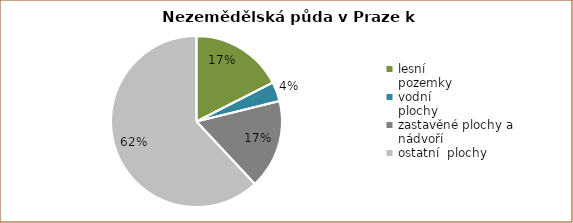
| Category | Series 0 |
|---|---|
| lesní 
pozemky | 5283.623 |
| vodní 
plochy | 1100.824 |
| zastavěné plochy a nádvoří | 5109.98 |
| ostatní  plochy | 18716.686 |